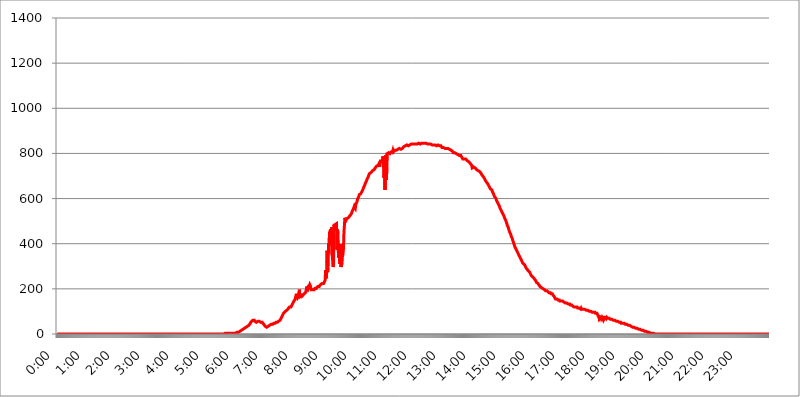
| Category | 2017.08.05. Intenzitás [W/m^2] |
|---|---|
| 0.0 | 0 |
| 0.0006944444444444445 | 0 |
| 0.001388888888888889 | 0 |
| 0.0020833333333333333 | 0 |
| 0.002777777777777778 | 0 |
| 0.003472222222222222 | 0 |
| 0.004166666666666667 | 0 |
| 0.004861111111111111 | 0 |
| 0.005555555555555556 | 0 |
| 0.0062499999999999995 | 0 |
| 0.006944444444444444 | 0 |
| 0.007638888888888889 | 0 |
| 0.008333333333333333 | 0 |
| 0.009027777777777779 | 0 |
| 0.009722222222222222 | 0 |
| 0.010416666666666666 | 0 |
| 0.011111111111111112 | 0 |
| 0.011805555555555555 | 0 |
| 0.012499999999999999 | 0 |
| 0.013194444444444444 | 0 |
| 0.013888888888888888 | 0 |
| 0.014583333333333332 | 0 |
| 0.015277777777777777 | 0 |
| 0.015972222222222224 | 0 |
| 0.016666666666666666 | 0 |
| 0.017361111111111112 | 0 |
| 0.018055555555555557 | 0 |
| 0.01875 | 0 |
| 0.019444444444444445 | 0 |
| 0.02013888888888889 | 0 |
| 0.020833333333333332 | 0 |
| 0.02152777777777778 | 0 |
| 0.022222222222222223 | 0 |
| 0.02291666666666667 | 0 |
| 0.02361111111111111 | 0 |
| 0.024305555555555556 | 0 |
| 0.024999999999999998 | 0 |
| 0.025694444444444447 | 0 |
| 0.02638888888888889 | 0 |
| 0.027083333333333334 | 0 |
| 0.027777777777777776 | 0 |
| 0.02847222222222222 | 0 |
| 0.029166666666666664 | 0 |
| 0.029861111111111113 | 0 |
| 0.030555555555555555 | 0 |
| 0.03125 | 0 |
| 0.03194444444444445 | 0 |
| 0.03263888888888889 | 0 |
| 0.03333333333333333 | 0 |
| 0.034027777777777775 | 0 |
| 0.034722222222222224 | 0 |
| 0.035416666666666666 | 0 |
| 0.036111111111111115 | 0 |
| 0.03680555555555556 | 0 |
| 0.0375 | 0 |
| 0.03819444444444444 | 0 |
| 0.03888888888888889 | 0 |
| 0.03958333333333333 | 0 |
| 0.04027777777777778 | 0 |
| 0.04097222222222222 | 0 |
| 0.041666666666666664 | 0 |
| 0.042361111111111106 | 0 |
| 0.04305555555555556 | 0 |
| 0.043750000000000004 | 0 |
| 0.044444444444444446 | 0 |
| 0.04513888888888889 | 0 |
| 0.04583333333333334 | 0 |
| 0.04652777777777778 | 0 |
| 0.04722222222222222 | 0 |
| 0.04791666666666666 | 0 |
| 0.04861111111111111 | 0 |
| 0.049305555555555554 | 0 |
| 0.049999999999999996 | 0 |
| 0.05069444444444445 | 0 |
| 0.051388888888888894 | 0 |
| 0.052083333333333336 | 0 |
| 0.05277777777777778 | 0 |
| 0.05347222222222222 | 0 |
| 0.05416666666666667 | 0 |
| 0.05486111111111111 | 0 |
| 0.05555555555555555 | 0 |
| 0.05625 | 0 |
| 0.05694444444444444 | 0 |
| 0.057638888888888885 | 0 |
| 0.05833333333333333 | 0 |
| 0.05902777777777778 | 0 |
| 0.059722222222222225 | 0 |
| 0.06041666666666667 | 0 |
| 0.061111111111111116 | 0 |
| 0.06180555555555556 | 0 |
| 0.0625 | 0 |
| 0.06319444444444444 | 0 |
| 0.06388888888888888 | 0 |
| 0.06458333333333334 | 0 |
| 0.06527777777777778 | 0 |
| 0.06597222222222222 | 0 |
| 0.06666666666666667 | 0 |
| 0.06736111111111111 | 0 |
| 0.06805555555555555 | 0 |
| 0.06874999999999999 | 0 |
| 0.06944444444444443 | 0 |
| 0.07013888888888889 | 0 |
| 0.07083333333333333 | 0 |
| 0.07152777777777779 | 0 |
| 0.07222222222222223 | 0 |
| 0.07291666666666667 | 0 |
| 0.07361111111111111 | 0 |
| 0.07430555555555556 | 0 |
| 0.075 | 0 |
| 0.07569444444444444 | 0 |
| 0.0763888888888889 | 0 |
| 0.07708333333333334 | 0 |
| 0.07777777777777778 | 0 |
| 0.07847222222222222 | 0 |
| 0.07916666666666666 | 0 |
| 0.0798611111111111 | 0 |
| 0.08055555555555556 | 0 |
| 0.08125 | 0 |
| 0.08194444444444444 | 0 |
| 0.08263888888888889 | 0 |
| 0.08333333333333333 | 0 |
| 0.08402777777777777 | 0 |
| 0.08472222222222221 | 0 |
| 0.08541666666666665 | 0 |
| 0.08611111111111112 | 0 |
| 0.08680555555555557 | 0 |
| 0.08750000000000001 | 0 |
| 0.08819444444444445 | 0 |
| 0.08888888888888889 | 0 |
| 0.08958333333333333 | 0 |
| 0.09027777777777778 | 0 |
| 0.09097222222222222 | 0 |
| 0.09166666666666667 | 0 |
| 0.09236111111111112 | 0 |
| 0.09305555555555556 | 0 |
| 0.09375 | 0 |
| 0.09444444444444444 | 0 |
| 0.09513888888888888 | 0 |
| 0.09583333333333333 | 0 |
| 0.09652777777777777 | 0 |
| 0.09722222222222222 | 0 |
| 0.09791666666666667 | 0 |
| 0.09861111111111111 | 0 |
| 0.09930555555555555 | 0 |
| 0.09999999999999999 | 0 |
| 0.10069444444444443 | 0 |
| 0.1013888888888889 | 0 |
| 0.10208333333333335 | 0 |
| 0.10277777777777779 | 0 |
| 0.10347222222222223 | 0 |
| 0.10416666666666667 | 0 |
| 0.10486111111111111 | 0 |
| 0.10555555555555556 | 0 |
| 0.10625 | 0 |
| 0.10694444444444444 | 0 |
| 0.1076388888888889 | 0 |
| 0.10833333333333334 | 0 |
| 0.10902777777777778 | 0 |
| 0.10972222222222222 | 0 |
| 0.1111111111111111 | 0 |
| 0.11180555555555556 | 0 |
| 0.11180555555555556 | 0 |
| 0.1125 | 0 |
| 0.11319444444444444 | 0 |
| 0.11388888888888889 | 0 |
| 0.11458333333333333 | 0 |
| 0.11527777777777777 | 0 |
| 0.11597222222222221 | 0 |
| 0.11666666666666665 | 0 |
| 0.1173611111111111 | 0 |
| 0.11805555555555557 | 0 |
| 0.11944444444444445 | 0 |
| 0.12013888888888889 | 0 |
| 0.12083333333333333 | 0 |
| 0.12152777777777778 | 0 |
| 0.12222222222222223 | 0 |
| 0.12291666666666667 | 0 |
| 0.12291666666666667 | 0 |
| 0.12361111111111112 | 0 |
| 0.12430555555555556 | 0 |
| 0.125 | 0 |
| 0.12569444444444444 | 0 |
| 0.12638888888888888 | 0 |
| 0.12708333333333333 | 0 |
| 0.16875 | 0 |
| 0.12847222222222224 | 0 |
| 0.12916666666666668 | 0 |
| 0.12986111111111112 | 0 |
| 0.13055555555555556 | 0 |
| 0.13125 | 0 |
| 0.13194444444444445 | 0 |
| 0.1326388888888889 | 0 |
| 0.13333333333333333 | 0 |
| 0.13402777777777777 | 0 |
| 0.13402777777777777 | 0 |
| 0.13472222222222222 | 0 |
| 0.13541666666666666 | 0 |
| 0.1361111111111111 | 0 |
| 0.13749999999999998 | 0 |
| 0.13819444444444443 | 0 |
| 0.1388888888888889 | 0 |
| 0.13958333333333334 | 0 |
| 0.14027777777777778 | 0 |
| 0.14097222222222222 | 0 |
| 0.14166666666666666 | 0 |
| 0.1423611111111111 | 0 |
| 0.14305555555555557 | 0 |
| 0.14375000000000002 | 0 |
| 0.14444444444444446 | 0 |
| 0.1451388888888889 | 0 |
| 0.1451388888888889 | 0 |
| 0.14652777777777778 | 0 |
| 0.14722222222222223 | 0 |
| 0.14791666666666667 | 0 |
| 0.1486111111111111 | 0 |
| 0.14930555555555555 | 0 |
| 0.15 | 0 |
| 0.15069444444444444 | 0 |
| 0.15138888888888888 | 0 |
| 0.15208333333333332 | 0 |
| 0.15277777777777776 | 0 |
| 0.15347222222222223 | 0 |
| 0.15416666666666667 | 0 |
| 0.15486111111111112 | 0 |
| 0.15555555555555556 | 0 |
| 0.15625 | 0 |
| 0.15694444444444444 | 0 |
| 0.15763888888888888 | 0 |
| 0.15833333333333333 | 0 |
| 0.15902777777777777 | 0 |
| 0.15972222222222224 | 0 |
| 0.16041666666666668 | 0 |
| 0.16111111111111112 | 0 |
| 0.16180555555555556 | 0 |
| 0.1625 | 0 |
| 0.16319444444444445 | 0 |
| 0.1638888888888889 | 0 |
| 0.16458333333333333 | 0 |
| 0.16527777777777777 | 0 |
| 0.16597222222222222 | 0 |
| 0.16666666666666666 | 0 |
| 0.1673611111111111 | 0 |
| 0.16805555555555554 | 0 |
| 0.16874999999999998 | 0 |
| 0.16944444444444443 | 0 |
| 0.17013888888888887 | 0 |
| 0.1708333333333333 | 0 |
| 0.17152777777777775 | 0 |
| 0.17222222222222225 | 0 |
| 0.1729166666666667 | 0 |
| 0.17361111111111113 | 0 |
| 0.17430555555555557 | 0 |
| 0.17500000000000002 | 0 |
| 0.17569444444444446 | 0 |
| 0.1763888888888889 | 0 |
| 0.17708333333333334 | 0 |
| 0.17777777777777778 | 0 |
| 0.17847222222222223 | 0 |
| 0.17916666666666667 | 0 |
| 0.1798611111111111 | 0 |
| 0.18055555555555555 | 0 |
| 0.18125 | 0 |
| 0.18194444444444444 | 0 |
| 0.1826388888888889 | 0 |
| 0.18333333333333335 | 0 |
| 0.1840277777777778 | 0 |
| 0.18472222222222223 | 0 |
| 0.18541666666666667 | 0 |
| 0.18611111111111112 | 0 |
| 0.18680555555555556 | 0 |
| 0.1875 | 0 |
| 0.18819444444444444 | 0 |
| 0.18888888888888888 | 0 |
| 0.18958333333333333 | 0 |
| 0.19027777777777777 | 0 |
| 0.1909722222222222 | 0 |
| 0.19166666666666665 | 0 |
| 0.19236111111111112 | 0 |
| 0.19305555555555554 | 0 |
| 0.19375 | 0 |
| 0.19444444444444445 | 0 |
| 0.1951388888888889 | 0 |
| 0.19583333333333333 | 0 |
| 0.19652777777777777 | 0 |
| 0.19722222222222222 | 0 |
| 0.19791666666666666 | 0 |
| 0.1986111111111111 | 0 |
| 0.19930555555555554 | 0 |
| 0.19999999999999998 | 0 |
| 0.20069444444444443 | 0 |
| 0.20138888888888887 | 0 |
| 0.2020833333333333 | 0 |
| 0.2027777777777778 | 0 |
| 0.2034722222222222 | 0 |
| 0.2041666666666667 | 0 |
| 0.20486111111111113 | 0 |
| 0.20555555555555557 | 0 |
| 0.20625000000000002 | 0 |
| 0.20694444444444446 | 0 |
| 0.2076388888888889 | 0 |
| 0.20833333333333334 | 0 |
| 0.20902777777777778 | 0 |
| 0.20972222222222223 | 0 |
| 0.21041666666666667 | 0 |
| 0.2111111111111111 | 0 |
| 0.21180555555555555 | 0 |
| 0.2125 | 0 |
| 0.21319444444444444 | 0 |
| 0.2138888888888889 | 0 |
| 0.21458333333333335 | 0 |
| 0.2152777777777778 | 0 |
| 0.21597222222222223 | 0 |
| 0.21666666666666667 | 0 |
| 0.21736111111111112 | 0 |
| 0.21805555555555556 | 0 |
| 0.21875 | 0 |
| 0.21944444444444444 | 0 |
| 0.22013888888888888 | 0 |
| 0.22083333333333333 | 0 |
| 0.22152777777777777 | 0 |
| 0.2222222222222222 | 0 |
| 0.22291666666666665 | 0 |
| 0.2236111111111111 | 0 |
| 0.22430555555555556 | 0 |
| 0.225 | 0 |
| 0.22569444444444445 | 0 |
| 0.2263888888888889 | 0 |
| 0.22708333333333333 | 0 |
| 0.22777777777777777 | 0 |
| 0.22847222222222222 | 0 |
| 0.22916666666666666 | 0 |
| 0.2298611111111111 | 0 |
| 0.23055555555555554 | 0 |
| 0.23124999999999998 | 0 |
| 0.23194444444444443 | 0 |
| 0.23263888888888887 | 0 |
| 0.2333333333333333 | 0 |
| 0.2340277777777778 | 3.525 |
| 0.2347222222222222 | 3.525 |
| 0.2354166666666667 | 3.525 |
| 0.23611111111111113 | 3.525 |
| 0.23680555555555557 | 3.525 |
| 0.23750000000000002 | 3.525 |
| 0.23819444444444446 | 3.525 |
| 0.2388888888888889 | 3.525 |
| 0.23958333333333334 | 3.525 |
| 0.24027777777777778 | 3.525 |
| 0.24097222222222223 | 3.525 |
| 0.24166666666666667 | 3.525 |
| 0.2423611111111111 | 3.525 |
| 0.24305555555555555 | 3.525 |
| 0.24375 | 3.525 |
| 0.24444444444444446 | 3.525 |
| 0.24513888888888888 | 3.525 |
| 0.24583333333333335 | 3.525 |
| 0.2465277777777778 | 3.525 |
| 0.24722222222222223 | 3.525 |
| 0.24791666666666667 | 3.525 |
| 0.24861111111111112 | 3.525 |
| 0.24930555555555556 | 3.525 |
| 0.25 | 3.525 |
| 0.25069444444444444 | 3.525 |
| 0.2513888888888889 | 3.525 |
| 0.2520833333333333 | 7.887 |
| 0.25277777777777777 | 7.887 |
| 0.2534722222222222 | 7.887 |
| 0.25416666666666665 | 7.887 |
| 0.2548611111111111 | 12.257 |
| 0.2555555555555556 | 12.257 |
| 0.25625000000000003 | 12.257 |
| 0.2569444444444445 | 12.257 |
| 0.2576388888888889 | 16.636 |
| 0.25833333333333336 | 16.636 |
| 0.2590277777777778 | 16.636 |
| 0.25972222222222224 | 21.024 |
| 0.2604166666666667 | 21.024 |
| 0.2611111111111111 | 21.024 |
| 0.26180555555555557 | 21.024 |
| 0.2625 | 25.419 |
| 0.26319444444444445 | 25.419 |
| 0.2638888888888889 | 25.419 |
| 0.26458333333333334 | 29.823 |
| 0.2652777777777778 | 29.823 |
| 0.2659722222222222 | 29.823 |
| 0.26666666666666666 | 34.234 |
| 0.2673611111111111 | 34.234 |
| 0.26805555555555555 | 38.653 |
| 0.26875 | 38.653 |
| 0.26944444444444443 | 43.079 |
| 0.2701388888888889 | 43.079 |
| 0.2708333333333333 | 47.511 |
| 0.27152777777777776 | 51.951 |
| 0.2722222222222222 | 51.951 |
| 0.27291666666666664 | 56.398 |
| 0.2736111111111111 | 56.398 |
| 0.2743055555555555 | 60.85 |
| 0.27499999999999997 | 60.85 |
| 0.27569444444444446 | 60.85 |
| 0.27638888888888885 | 60.85 |
| 0.27708333333333335 | 56.398 |
| 0.2777777777777778 | 56.398 |
| 0.27847222222222223 | 56.398 |
| 0.2791666666666667 | 51.951 |
| 0.2798611111111111 | 51.951 |
| 0.28055555555555556 | 51.951 |
| 0.28125 | 56.398 |
| 0.28194444444444444 | 56.398 |
| 0.2826388888888889 | 56.398 |
| 0.2833333333333333 | 56.398 |
| 0.28402777777777777 | 56.398 |
| 0.2847222222222222 | 56.398 |
| 0.28541666666666665 | 51.951 |
| 0.28611111111111115 | 51.951 |
| 0.28680555555555554 | 51.951 |
| 0.28750000000000003 | 51.951 |
| 0.2881944444444445 | 47.511 |
| 0.2888888888888889 | 47.511 |
| 0.28958333333333336 | 43.079 |
| 0.2902777777777778 | 38.653 |
| 0.29097222222222224 | 38.653 |
| 0.2916666666666667 | 34.234 |
| 0.2923611111111111 | 34.234 |
| 0.29305555555555557 | 29.823 |
| 0.29375 | 29.823 |
| 0.29444444444444445 | 29.823 |
| 0.2951388888888889 | 29.823 |
| 0.29583333333333334 | 34.234 |
| 0.2965277777777778 | 34.234 |
| 0.2972222222222222 | 38.653 |
| 0.29791666666666666 | 38.653 |
| 0.2986111111111111 | 38.653 |
| 0.29930555555555555 | 38.653 |
| 0.3 | 43.079 |
| 0.30069444444444443 | 43.079 |
| 0.3013888888888889 | 43.079 |
| 0.3020833333333333 | 43.079 |
| 0.30277777777777776 | 43.079 |
| 0.3034722222222222 | 47.511 |
| 0.30416666666666664 | 47.511 |
| 0.3048611111111111 | 47.511 |
| 0.3055555555555555 | 47.511 |
| 0.30624999999999997 | 47.511 |
| 0.3069444444444444 | 51.951 |
| 0.3076388888888889 | 51.951 |
| 0.30833333333333335 | 51.951 |
| 0.3090277777777778 | 51.951 |
| 0.30972222222222223 | 51.951 |
| 0.3104166666666667 | 56.398 |
| 0.3111111111111111 | 56.398 |
| 0.31180555555555556 | 56.398 |
| 0.3125 | 60.85 |
| 0.31319444444444444 | 65.31 |
| 0.3138888888888889 | 69.775 |
| 0.3145833333333333 | 74.246 |
| 0.31527777777777777 | 78.722 |
| 0.3159722222222222 | 83.205 |
| 0.31666666666666665 | 87.692 |
| 0.31736111111111115 | 92.184 |
| 0.31805555555555554 | 92.184 |
| 0.31875000000000003 | 96.682 |
| 0.3194444444444445 | 96.682 |
| 0.3201388888888889 | 101.184 |
| 0.32083333333333336 | 101.184 |
| 0.3215277777777778 | 101.184 |
| 0.32222222222222224 | 105.69 |
| 0.3229166666666667 | 105.69 |
| 0.3236111111111111 | 110.201 |
| 0.32430555555555557 | 114.716 |
| 0.325 | 114.716 |
| 0.32569444444444445 | 119.235 |
| 0.3263888888888889 | 119.235 |
| 0.32708333333333334 | 119.235 |
| 0.3277777777777778 | 119.235 |
| 0.3284722222222222 | 123.758 |
| 0.32916666666666666 | 128.284 |
| 0.3298611111111111 | 132.814 |
| 0.33055555555555555 | 137.347 |
| 0.33125 | 141.884 |
| 0.33194444444444443 | 146.423 |
| 0.3326388888888889 | 146.423 |
| 0.3333333333333333 | 150.964 |
| 0.3340277777777778 | 160.056 |
| 0.3347222222222222 | 160.056 |
| 0.3354166666666667 | 178.264 |
| 0.3361111111111111 | 164.605 |
| 0.3368055555555556 | 160.056 |
| 0.33749999999999997 | 164.605 |
| 0.33819444444444446 | 169.156 |
| 0.33888888888888885 | 182.82 |
| 0.33958333333333335 | 196.497 |
| 0.34027777777777773 | 164.605 |
| 0.34097222222222223 | 164.605 |
| 0.3416666666666666 | 164.605 |
| 0.3423611111111111 | 169.156 |
| 0.3430555555555555 | 178.264 |
| 0.34375 | 169.156 |
| 0.3444444444444445 | 169.156 |
| 0.3451388888888889 | 173.709 |
| 0.3458333333333334 | 173.709 |
| 0.34652777777777777 | 178.264 |
| 0.34722222222222227 | 178.264 |
| 0.34791666666666665 | 182.82 |
| 0.34861111111111115 | 187.378 |
| 0.34930555555555554 | 196.497 |
| 0.35000000000000003 | 210.182 |
| 0.3506944444444444 | 201.058 |
| 0.3513888888888889 | 205.62 |
| 0.3520833333333333 | 201.058 |
| 0.3527777777777778 | 201.058 |
| 0.3534722222222222 | 201.058 |
| 0.3541666666666667 | 219.309 |
| 0.3548611111111111 | 214.746 |
| 0.35555555555555557 | 205.62 |
| 0.35625 | 196.497 |
| 0.35694444444444445 | 196.497 |
| 0.3576388888888889 | 196.497 |
| 0.35833333333333334 | 196.497 |
| 0.3590277777777778 | 196.497 |
| 0.3597222222222222 | 196.497 |
| 0.36041666666666666 | 196.497 |
| 0.3611111111111111 | 201.058 |
| 0.36180555555555555 | 201.058 |
| 0.3625 | 201.058 |
| 0.36319444444444443 | 201.058 |
| 0.3638888888888889 | 205.62 |
| 0.3645833333333333 | 205.62 |
| 0.3652777777777778 | 210.182 |
| 0.3659722222222222 | 210.182 |
| 0.3666666666666667 | 210.182 |
| 0.3673611111111111 | 210.182 |
| 0.3680555555555556 | 214.746 |
| 0.36874999999999997 | 214.746 |
| 0.36944444444444446 | 219.309 |
| 0.37013888888888885 | 219.309 |
| 0.37083333333333335 | 219.309 |
| 0.37152777777777773 | 223.873 |
| 0.37222222222222223 | 223.873 |
| 0.3729166666666666 | 223.873 |
| 0.3736111111111111 | 223.873 |
| 0.3743055555555555 | 228.436 |
| 0.375 | 233 |
| 0.3756944444444445 | 237.564 |
| 0.3763888888888889 | 283.156 |
| 0.3770833333333334 | 246.689 |
| 0.37777777777777777 | 264.932 |
| 0.37847222222222227 | 369.23 |
| 0.37916666666666665 | 274.047 |
| 0.37986111111111115 | 292.259 |
| 0.38055555555555554 | 400.638 |
| 0.38125000000000003 | 391.685 |
| 0.3819444444444444 | 449.551 |
| 0.3826388888888889 | 445.129 |
| 0.3833333333333333 | 462.786 |
| 0.3840277777777778 | 396.164 |
| 0.3847222222222222 | 471.582 |
| 0.3854166666666667 | 351.198 |
| 0.3861111111111111 | 333.113 |
| 0.38680555555555557 | 296.808 |
| 0.3875 | 305.898 |
| 0.38819444444444445 | 484.735 |
| 0.3888888888888889 | 458.38 |
| 0.38958333333333334 | 484.735 |
| 0.3902777777777778 | 484.735 |
| 0.3909722222222222 | 484.735 |
| 0.39166666666666666 | 489.108 |
| 0.3923611111111111 | 373.729 |
| 0.39305555555555555 | 462.786 |
| 0.39375 | 445.129 |
| 0.39444444444444443 | 337.639 |
| 0.3951388888888889 | 346.682 |
| 0.3958333333333333 | 378.224 |
| 0.3965277777777778 | 310.44 |
| 0.3972222222222222 | 396.164 |
| 0.3979166666666667 | 296.808 |
| 0.3986111111111111 | 305.898 |
| 0.3993055555555556 | 310.44 |
| 0.39999999999999997 | 346.682 |
| 0.40069444444444446 | 351.198 |
| 0.40138888888888885 | 378.224 |
| 0.40208333333333335 | 449.551 |
| 0.40277777777777773 | 453.968 |
| 0.40347222222222223 | 515.223 |
| 0.4041666666666666 | 515.223 |
| 0.4048611111111111 | 502.192 |
| 0.4055555555555555 | 506.542 |
| 0.40625 | 510.885 |
| 0.4069444444444445 | 510.885 |
| 0.4076388888888889 | 510.885 |
| 0.4083333333333334 | 515.223 |
| 0.40902777777777777 | 515.223 |
| 0.40972222222222227 | 519.555 |
| 0.41041666666666665 | 523.88 |
| 0.41111111111111115 | 523.88 |
| 0.41180555555555554 | 528.2 |
| 0.41250000000000003 | 532.513 |
| 0.4131944444444444 | 536.82 |
| 0.4138888888888889 | 545.416 |
| 0.4145833333333333 | 549.704 |
| 0.4152777777777778 | 553.986 |
| 0.4159722222222222 | 558.261 |
| 0.4166666666666667 | 566.793 |
| 0.4173611111111111 | 566.793 |
| 0.41805555555555557 | 558.261 |
| 0.41875 | 575.299 |
| 0.41944444444444445 | 575.299 |
| 0.4201388888888889 | 583.779 |
| 0.42083333333333334 | 592.233 |
| 0.4215277777777778 | 600.661 |
| 0.4222222222222222 | 604.864 |
| 0.42291666666666666 | 609.062 |
| 0.4236111111111111 | 617.436 |
| 0.42430555555555555 | 617.436 |
| 0.425 | 617.436 |
| 0.42569444444444443 | 621.613 |
| 0.4263888888888889 | 621.613 |
| 0.4270833333333333 | 629.948 |
| 0.4277777777777778 | 634.105 |
| 0.4284722222222222 | 638.256 |
| 0.4291666666666667 | 642.4 |
| 0.4298611111111111 | 650.667 |
| 0.4305555555555556 | 654.791 |
| 0.43124999999999997 | 658.909 |
| 0.43194444444444446 | 667.123 |
| 0.43263888888888885 | 667.123 |
| 0.43333333333333335 | 675.311 |
| 0.43402777777777773 | 679.395 |
| 0.43472222222222223 | 687.544 |
| 0.4354166666666666 | 687.544 |
| 0.4361111111111111 | 695.666 |
| 0.4368055555555555 | 703.762 |
| 0.4375 | 707.8 |
| 0.4381944444444445 | 711.832 |
| 0.4388888888888889 | 715.858 |
| 0.4395833333333334 | 711.832 |
| 0.44027777777777777 | 715.858 |
| 0.44097222222222227 | 715.858 |
| 0.44166666666666665 | 715.858 |
| 0.44236111111111115 | 723.889 |
| 0.44305555555555554 | 727.896 |
| 0.44375000000000003 | 727.896 |
| 0.4444444444444444 | 727.896 |
| 0.4451388888888889 | 731.896 |
| 0.4458333333333333 | 735.89 |
| 0.4465277777777778 | 735.89 |
| 0.4472222222222222 | 739.877 |
| 0.4479166666666667 | 743.859 |
| 0.4486111111111111 | 743.859 |
| 0.44930555555555557 | 747.834 |
| 0.45 | 747.834 |
| 0.45069444444444445 | 751.803 |
| 0.4513888888888889 | 755.766 |
| 0.45208333333333334 | 739.877 |
| 0.4527777777777778 | 759.723 |
| 0.4534722222222222 | 759.723 |
| 0.45416666666666666 | 763.674 |
| 0.4548611111111111 | 767.62 |
| 0.45555555555555555 | 771.559 |
| 0.45625 | 775.492 |
| 0.45694444444444443 | 787.258 |
| 0.4576388888888889 | 747.834 |
| 0.4583333333333333 | 691.608 |
| 0.4590277777777778 | 779.42 |
| 0.4597222222222222 | 638.256 |
| 0.4604166666666667 | 791.169 |
| 0.4611111111111111 | 775.492 |
| 0.4618055555555556 | 683.473 |
| 0.46249999999999997 | 798.974 |
| 0.46319444444444446 | 798.974 |
| 0.46388888888888885 | 798.974 |
| 0.46458333333333335 | 802.868 |
| 0.46527777777777773 | 798.974 |
| 0.46597222222222223 | 798.974 |
| 0.4666666666666666 | 798.974 |
| 0.4673611111111111 | 802.868 |
| 0.4680555555555555 | 806.757 |
| 0.46875 | 806.757 |
| 0.4694444444444445 | 806.757 |
| 0.4701388888888889 | 806.757 |
| 0.4708333333333334 | 814.519 |
| 0.47152777777777777 | 806.757 |
| 0.47222222222222227 | 810.641 |
| 0.47291666666666665 | 810.641 |
| 0.47361111111111115 | 814.519 |
| 0.47430555555555554 | 814.519 |
| 0.47500000000000003 | 814.519 |
| 0.4756944444444444 | 814.519 |
| 0.4763888888888889 | 818.392 |
| 0.4770833333333333 | 818.392 |
| 0.4777777777777778 | 818.392 |
| 0.4784722222222222 | 814.519 |
| 0.4791666666666667 | 822.26 |
| 0.4798611111111111 | 822.26 |
| 0.48055555555555557 | 822.26 |
| 0.48125 | 822.26 |
| 0.48194444444444445 | 818.392 |
| 0.4826388888888889 | 818.392 |
| 0.48333333333333334 | 818.392 |
| 0.4840277777777778 | 822.26 |
| 0.4847222222222222 | 822.26 |
| 0.48541666666666666 | 826.123 |
| 0.4861111111111111 | 829.981 |
| 0.48680555555555555 | 826.123 |
| 0.4875 | 829.981 |
| 0.48819444444444443 | 833.834 |
| 0.4888888888888889 | 833.834 |
| 0.4895833333333333 | 829.981 |
| 0.4902777777777778 | 837.682 |
| 0.4909722222222222 | 833.834 |
| 0.4916666666666667 | 833.834 |
| 0.4923611111111111 | 833.834 |
| 0.4930555555555556 | 833.834 |
| 0.49374999999999997 | 837.682 |
| 0.49444444444444446 | 837.682 |
| 0.49513888888888885 | 841.526 |
| 0.49583333333333335 | 841.526 |
| 0.49652777777777773 | 841.526 |
| 0.49722222222222223 | 841.526 |
| 0.4979166666666666 | 841.526 |
| 0.4986111111111111 | 841.526 |
| 0.4993055555555555 | 841.526 |
| 0.5 | 845.365 |
| 0.5006944444444444 | 841.526 |
| 0.5013888888888889 | 841.526 |
| 0.5020833333333333 | 837.682 |
| 0.5027777777777778 | 841.526 |
| 0.5034722222222222 | 845.365 |
| 0.5041666666666667 | 845.365 |
| 0.5048611111111111 | 841.526 |
| 0.5055555555555555 | 841.526 |
| 0.50625 | 841.526 |
| 0.5069444444444444 | 845.365 |
| 0.5076388888888889 | 841.526 |
| 0.5083333333333333 | 841.526 |
| 0.5090277777777777 | 841.526 |
| 0.5097222222222222 | 845.365 |
| 0.5104166666666666 | 841.526 |
| 0.5111111111111112 | 845.365 |
| 0.5118055555555555 | 845.365 |
| 0.5125000000000001 | 845.365 |
| 0.5131944444444444 | 845.365 |
| 0.513888888888889 | 845.365 |
| 0.5145833333333333 | 845.365 |
| 0.5152777777777778 | 845.365 |
| 0.5159722222222222 | 845.365 |
| 0.5166666666666667 | 845.365 |
| 0.517361111111111 | 845.365 |
| 0.5180555555555556 | 845.365 |
| 0.5187499999999999 | 841.526 |
| 0.5194444444444445 | 841.526 |
| 0.5201388888888888 | 841.526 |
| 0.5208333333333334 | 841.526 |
| 0.5215277777777778 | 841.526 |
| 0.5222222222222223 | 841.526 |
| 0.5229166666666667 | 841.526 |
| 0.5236111111111111 | 841.526 |
| 0.5243055555555556 | 837.682 |
| 0.525 | 837.682 |
| 0.5256944444444445 | 837.682 |
| 0.5263888888888889 | 837.682 |
| 0.5270833333333333 | 837.682 |
| 0.5277777777777778 | 837.682 |
| 0.5284722222222222 | 837.682 |
| 0.5291666666666667 | 837.682 |
| 0.5298611111111111 | 837.682 |
| 0.5305555555555556 | 837.682 |
| 0.53125 | 837.682 |
| 0.5319444444444444 | 833.834 |
| 0.5326388888888889 | 833.834 |
| 0.5333333333333333 | 833.834 |
| 0.5340277777777778 | 837.682 |
| 0.5347222222222222 | 837.682 |
| 0.5354166666666667 | 837.682 |
| 0.5361111111111111 | 833.834 |
| 0.5368055555555555 | 833.834 |
| 0.5375 | 833.834 |
| 0.5381944444444444 | 833.834 |
| 0.5388888888888889 | 829.981 |
| 0.5395833333333333 | 826.123 |
| 0.5402777777777777 | 826.123 |
| 0.5409722222222222 | 826.123 |
| 0.5416666666666666 | 826.123 |
| 0.5423611111111112 | 822.26 |
| 0.5430555555555555 | 826.123 |
| 0.5437500000000001 | 822.26 |
| 0.5444444444444444 | 826.123 |
| 0.545138888888889 | 822.26 |
| 0.5458333333333333 | 822.26 |
| 0.5465277777777778 | 822.26 |
| 0.5472222222222222 | 822.26 |
| 0.5479166666666667 | 822.26 |
| 0.548611111111111 | 818.392 |
| 0.5493055555555556 | 818.392 |
| 0.5499999999999999 | 818.392 |
| 0.5506944444444445 | 818.392 |
| 0.5513888888888888 | 814.519 |
| 0.5520833333333334 | 814.519 |
| 0.5527777777777778 | 814.519 |
| 0.5534722222222223 | 814.519 |
| 0.5541666666666667 | 810.641 |
| 0.5548611111111111 | 806.757 |
| 0.5555555555555556 | 802.868 |
| 0.55625 | 802.868 |
| 0.5569444444444445 | 802.868 |
| 0.5576388888888889 | 802.868 |
| 0.5583333333333333 | 798.974 |
| 0.5590277777777778 | 802.868 |
| 0.5597222222222222 | 798.974 |
| 0.5604166666666667 | 798.974 |
| 0.5611111111111111 | 798.974 |
| 0.5618055555555556 | 795.074 |
| 0.5625 | 795.074 |
| 0.5631944444444444 | 791.169 |
| 0.5638888888888889 | 791.169 |
| 0.5645833333333333 | 795.074 |
| 0.5652777777777778 | 791.169 |
| 0.5659722222222222 | 791.169 |
| 0.5666666666666667 | 787.258 |
| 0.5673611111111111 | 783.342 |
| 0.5680555555555555 | 779.42 |
| 0.56875 | 775.492 |
| 0.5694444444444444 | 779.42 |
| 0.5701388888888889 | 775.492 |
| 0.5708333333333333 | 775.492 |
| 0.5715277777777777 | 775.492 |
| 0.5722222222222222 | 771.559 |
| 0.5729166666666666 | 775.492 |
| 0.5736111111111112 | 775.492 |
| 0.5743055555555555 | 771.559 |
| 0.5750000000000001 | 767.62 |
| 0.5756944444444444 | 767.62 |
| 0.576388888888889 | 763.674 |
| 0.5770833333333333 | 763.674 |
| 0.5777777777777778 | 759.723 |
| 0.5784722222222222 | 759.723 |
| 0.5791666666666667 | 755.766 |
| 0.579861111111111 | 751.803 |
| 0.5805555555555556 | 751.803 |
| 0.5812499999999999 | 747.834 |
| 0.5819444444444445 | 735.89 |
| 0.5826388888888888 | 739.877 |
| 0.5833333333333334 | 739.877 |
| 0.5840277777777778 | 739.877 |
| 0.5847222222222223 | 735.89 |
| 0.5854166666666667 | 735.89 |
| 0.5861111111111111 | 735.89 |
| 0.5868055555555556 | 731.896 |
| 0.5875 | 731.896 |
| 0.5881944444444445 | 727.896 |
| 0.5888888888888889 | 727.896 |
| 0.5895833333333333 | 727.896 |
| 0.5902777777777778 | 723.889 |
| 0.5909722222222222 | 723.889 |
| 0.5916666666666667 | 719.877 |
| 0.5923611111111111 | 719.877 |
| 0.5930555555555556 | 715.858 |
| 0.59375 | 715.858 |
| 0.5944444444444444 | 711.832 |
| 0.5951388888888889 | 711.832 |
| 0.5958333333333333 | 703.762 |
| 0.5965277777777778 | 703.762 |
| 0.5972222222222222 | 699.717 |
| 0.5979166666666667 | 695.666 |
| 0.5986111111111111 | 691.608 |
| 0.5993055555555555 | 687.544 |
| 0.6 | 683.473 |
| 0.6006944444444444 | 683.473 |
| 0.6013888888888889 | 675.311 |
| 0.6020833333333333 | 675.311 |
| 0.6027777777777777 | 671.22 |
| 0.6034722222222222 | 667.123 |
| 0.6041666666666666 | 663.019 |
| 0.6048611111111112 | 658.909 |
| 0.6055555555555555 | 654.791 |
| 0.6062500000000001 | 650.667 |
| 0.6069444444444444 | 650.667 |
| 0.607638888888889 | 642.4 |
| 0.6083333333333333 | 642.4 |
| 0.6090277777777778 | 642.4 |
| 0.6097222222222222 | 638.256 |
| 0.6104166666666667 | 629.948 |
| 0.611111111111111 | 625.784 |
| 0.6118055555555556 | 621.613 |
| 0.6124999999999999 | 617.436 |
| 0.6131944444444445 | 609.062 |
| 0.6138888888888888 | 609.062 |
| 0.6145833333333334 | 604.864 |
| 0.6152777777777778 | 600.661 |
| 0.6159722222222223 | 592.233 |
| 0.6166666666666667 | 588.009 |
| 0.6173611111111111 | 583.779 |
| 0.6180555555555556 | 579.542 |
| 0.61875 | 575.299 |
| 0.6194444444444445 | 571.049 |
| 0.6201388888888889 | 566.793 |
| 0.6208333333333333 | 558.261 |
| 0.6215277777777778 | 553.986 |
| 0.6222222222222222 | 549.704 |
| 0.6229166666666667 | 545.416 |
| 0.6236111111111111 | 541.121 |
| 0.6243055555555556 | 541.121 |
| 0.625 | 532.513 |
| 0.6256944444444444 | 528.2 |
| 0.6263888888888889 | 523.88 |
| 0.6270833333333333 | 519.555 |
| 0.6277777777777778 | 510.885 |
| 0.6284722222222222 | 506.542 |
| 0.6291666666666667 | 502.192 |
| 0.6298611111111111 | 497.836 |
| 0.6305555555555555 | 489.108 |
| 0.63125 | 480.356 |
| 0.6319444444444444 | 475.972 |
| 0.6326388888888889 | 471.582 |
| 0.6333333333333333 | 462.786 |
| 0.6340277777777777 | 458.38 |
| 0.6347222222222222 | 449.551 |
| 0.6354166666666666 | 445.129 |
| 0.6361111111111112 | 440.702 |
| 0.6368055555555555 | 431.833 |
| 0.6375000000000001 | 427.39 |
| 0.6381944444444444 | 422.943 |
| 0.638888888888889 | 414.035 |
| 0.6395833333333333 | 409.574 |
| 0.6402777777777778 | 400.638 |
| 0.6409722222222222 | 396.164 |
| 0.6416666666666667 | 387.202 |
| 0.642361111111111 | 382.715 |
| 0.6430555555555556 | 378.224 |
| 0.6437499999999999 | 373.729 |
| 0.6444444444444445 | 369.23 |
| 0.6451388888888888 | 364.728 |
| 0.6458333333333334 | 360.221 |
| 0.6465277777777778 | 355.712 |
| 0.6472222222222223 | 351.198 |
| 0.6479166666666667 | 346.682 |
| 0.6486111111111111 | 342.162 |
| 0.6493055555555556 | 337.639 |
| 0.65 | 333.113 |
| 0.6506944444444445 | 328.584 |
| 0.6513888888888889 | 324.052 |
| 0.6520833333333333 | 319.517 |
| 0.6527777777777778 | 314.98 |
| 0.6534722222222222 | 314.98 |
| 0.6541666666666667 | 310.44 |
| 0.6548611111111111 | 310.44 |
| 0.6555555555555556 | 305.898 |
| 0.65625 | 301.354 |
| 0.6569444444444444 | 296.808 |
| 0.6576388888888889 | 292.259 |
| 0.6583333333333333 | 292.259 |
| 0.6590277777777778 | 287.709 |
| 0.6597222222222222 | 283.156 |
| 0.6604166666666667 | 283.156 |
| 0.6611111111111111 | 278.603 |
| 0.6618055555555555 | 278.603 |
| 0.6625 | 274.047 |
| 0.6631944444444444 | 269.49 |
| 0.6638888888888889 | 264.932 |
| 0.6645833333333333 | 260.373 |
| 0.6652777777777777 | 260.373 |
| 0.6659722222222222 | 255.813 |
| 0.6666666666666666 | 255.813 |
| 0.6673611111111111 | 251.251 |
| 0.6680555555555556 | 251.251 |
| 0.6687500000000001 | 246.689 |
| 0.6694444444444444 | 242.127 |
| 0.6701388888888888 | 242.127 |
| 0.6708333333333334 | 237.564 |
| 0.6715277777777778 | 233 |
| 0.6722222222222222 | 228.436 |
| 0.6729166666666666 | 228.436 |
| 0.6736111111111112 | 228.436 |
| 0.6743055555555556 | 223.873 |
| 0.6749999999999999 | 219.309 |
| 0.6756944444444444 | 219.309 |
| 0.6763888888888889 | 214.746 |
| 0.6770833333333334 | 210.182 |
| 0.6777777777777777 | 210.182 |
| 0.6784722222222223 | 210.182 |
| 0.6791666666666667 | 205.62 |
| 0.6798611111111111 | 205.62 |
| 0.6805555555555555 | 205.62 |
| 0.68125 | 201.058 |
| 0.6819444444444445 | 201.058 |
| 0.6826388888888889 | 201.058 |
| 0.6833333333333332 | 196.497 |
| 0.6840277777777778 | 196.497 |
| 0.6847222222222222 | 191.937 |
| 0.6854166666666667 | 191.937 |
| 0.686111111111111 | 191.937 |
| 0.6868055555555556 | 191.937 |
| 0.6875 | 191.937 |
| 0.6881944444444444 | 187.378 |
| 0.688888888888889 | 187.378 |
| 0.6895833333333333 | 182.82 |
| 0.6902777777777778 | 182.82 |
| 0.6909722222222222 | 182.82 |
| 0.6916666666666668 | 182.82 |
| 0.6923611111111111 | 178.264 |
| 0.6930555555555555 | 178.264 |
| 0.69375 | 178.264 |
| 0.6944444444444445 | 178.264 |
| 0.6951388888888889 | 173.709 |
| 0.6958333333333333 | 173.709 |
| 0.6965277777777777 | 173.709 |
| 0.6972222222222223 | 164.605 |
| 0.6979166666666666 | 160.056 |
| 0.6986111111111111 | 155.509 |
| 0.6993055555555556 | 155.509 |
| 0.7000000000000001 | 155.509 |
| 0.7006944444444444 | 155.509 |
| 0.7013888888888888 | 155.509 |
| 0.7020833333333334 | 150.964 |
| 0.7027777777777778 | 150.964 |
| 0.7034722222222222 | 150.964 |
| 0.7041666666666666 | 150.964 |
| 0.7048611111111112 | 146.423 |
| 0.7055555555555556 | 146.423 |
| 0.7062499999999999 | 146.423 |
| 0.7069444444444444 | 146.423 |
| 0.7076388888888889 | 146.423 |
| 0.7083333333333334 | 146.423 |
| 0.7090277777777777 | 146.423 |
| 0.7097222222222223 | 146.423 |
| 0.7104166666666667 | 141.884 |
| 0.7111111111111111 | 141.884 |
| 0.7118055555555555 | 141.884 |
| 0.7125 | 137.347 |
| 0.7131944444444445 | 137.347 |
| 0.7138888888888889 | 137.347 |
| 0.7145833333333332 | 137.347 |
| 0.7152777777777778 | 137.347 |
| 0.7159722222222222 | 137.347 |
| 0.7166666666666667 | 132.814 |
| 0.717361111111111 | 132.814 |
| 0.7180555555555556 | 132.814 |
| 0.71875 | 132.814 |
| 0.7194444444444444 | 128.284 |
| 0.720138888888889 | 128.284 |
| 0.7208333333333333 | 128.284 |
| 0.7215277777777778 | 128.284 |
| 0.7222222222222222 | 128.284 |
| 0.7229166666666668 | 123.758 |
| 0.7236111111111111 | 123.758 |
| 0.7243055555555555 | 123.758 |
| 0.725 | 119.235 |
| 0.7256944444444445 | 119.235 |
| 0.7263888888888889 | 119.235 |
| 0.7270833333333333 | 119.235 |
| 0.7277777777777777 | 119.235 |
| 0.7284722222222223 | 119.235 |
| 0.7291666666666666 | 119.235 |
| 0.7298611111111111 | 114.716 |
| 0.7305555555555556 | 114.716 |
| 0.7312500000000001 | 114.716 |
| 0.7319444444444444 | 114.716 |
| 0.7326388888888888 | 114.716 |
| 0.7333333333333334 | 114.716 |
| 0.7340277777777778 | 110.201 |
| 0.7347222222222222 | 114.716 |
| 0.7354166666666666 | 110.201 |
| 0.7361111111111112 | 110.201 |
| 0.7368055555555556 | 110.201 |
| 0.7374999999999999 | 110.201 |
| 0.7381944444444444 | 110.201 |
| 0.7388888888888889 | 110.201 |
| 0.7395833333333334 | 110.201 |
| 0.7402777777777777 | 110.201 |
| 0.7409722222222223 | 110.201 |
| 0.7416666666666667 | 105.69 |
| 0.7423611111111111 | 105.69 |
| 0.7430555555555555 | 105.69 |
| 0.74375 | 105.69 |
| 0.7444444444444445 | 105.69 |
| 0.7451388888888889 | 105.69 |
| 0.7458333333333332 | 101.184 |
| 0.7465277777777778 | 101.184 |
| 0.7472222222222222 | 101.184 |
| 0.7479166666666667 | 101.184 |
| 0.748611111111111 | 101.184 |
| 0.7493055555555556 | 101.184 |
| 0.75 | 96.682 |
| 0.7506944444444444 | 96.682 |
| 0.751388888888889 | 96.682 |
| 0.7520833333333333 | 96.682 |
| 0.7527777777777778 | 96.682 |
| 0.7534722222222222 | 96.682 |
| 0.7541666666666668 | 96.682 |
| 0.7548611111111111 | 92.184 |
| 0.7555555555555555 | 92.184 |
| 0.75625 | 92.184 |
| 0.7569444444444445 | 92.184 |
| 0.7576388888888889 | 92.184 |
| 0.7583333333333333 | 83.205 |
| 0.7590277777777777 | 74.246 |
| 0.7597222222222223 | 83.205 |
| 0.7604166666666666 | 65.31 |
| 0.7611111111111111 | 65.31 |
| 0.7618055555555556 | 69.775 |
| 0.7625000000000001 | 78.722 |
| 0.7631944444444444 | 69.775 |
| 0.7638888888888888 | 74.246 |
| 0.7645833333333334 | 69.775 |
| 0.7652777777777778 | 65.31 |
| 0.7659722222222222 | 60.85 |
| 0.7666666666666666 | 65.31 |
| 0.7673611111111112 | 74.246 |
| 0.7680555555555556 | 74.246 |
| 0.7687499999999999 | 74.246 |
| 0.7694444444444444 | 74.246 |
| 0.7701388888888889 | 69.775 |
| 0.7708333333333334 | 74.246 |
| 0.7715277777777777 | 74.246 |
| 0.7722222222222223 | 69.775 |
| 0.7729166666666667 | 69.775 |
| 0.7736111111111111 | 69.775 |
| 0.7743055555555555 | 69.775 |
| 0.775 | 69.775 |
| 0.7756944444444445 | 65.31 |
| 0.7763888888888889 | 65.31 |
| 0.7770833333333332 | 65.31 |
| 0.7777777777777778 | 65.31 |
| 0.7784722222222222 | 65.31 |
| 0.7791666666666667 | 65.31 |
| 0.779861111111111 | 60.85 |
| 0.7805555555555556 | 60.85 |
| 0.78125 | 60.85 |
| 0.7819444444444444 | 60.85 |
| 0.782638888888889 | 60.85 |
| 0.7833333333333333 | 60.85 |
| 0.7840277777777778 | 56.398 |
| 0.7847222222222222 | 56.398 |
| 0.7854166666666668 | 56.398 |
| 0.7861111111111111 | 56.398 |
| 0.7868055555555555 | 56.398 |
| 0.7875 | 56.398 |
| 0.7881944444444445 | 51.951 |
| 0.7888888888888889 | 51.951 |
| 0.7895833333333333 | 51.951 |
| 0.7902777777777777 | 51.951 |
| 0.7909722222222223 | 47.511 |
| 0.7916666666666666 | 47.511 |
| 0.7923611111111111 | 47.511 |
| 0.7930555555555556 | 47.511 |
| 0.7937500000000001 | 47.511 |
| 0.7944444444444444 | 47.511 |
| 0.7951388888888888 | 47.511 |
| 0.7958333333333334 | 47.511 |
| 0.7965277777777778 | 43.079 |
| 0.7972222222222222 | 43.079 |
| 0.7979166666666666 | 43.079 |
| 0.7986111111111112 | 43.079 |
| 0.7993055555555556 | 38.653 |
| 0.7999999999999999 | 38.653 |
| 0.8006944444444444 | 38.653 |
| 0.8013888888888889 | 38.653 |
| 0.8020833333333334 | 38.653 |
| 0.8027777777777777 | 38.653 |
| 0.8034722222222223 | 34.234 |
| 0.8041666666666667 | 34.234 |
| 0.8048611111111111 | 34.234 |
| 0.8055555555555555 | 34.234 |
| 0.80625 | 34.234 |
| 0.8069444444444445 | 29.823 |
| 0.8076388888888889 | 29.823 |
| 0.8083333333333332 | 29.823 |
| 0.8090277777777778 | 29.823 |
| 0.8097222222222222 | 25.419 |
| 0.8104166666666667 | 25.419 |
| 0.811111111111111 | 25.419 |
| 0.8118055555555556 | 25.419 |
| 0.8125 | 25.419 |
| 0.8131944444444444 | 25.419 |
| 0.813888888888889 | 25.419 |
| 0.8145833333333333 | 21.024 |
| 0.8152777777777778 | 21.024 |
| 0.8159722222222222 | 21.024 |
| 0.8166666666666668 | 21.024 |
| 0.8173611111111111 | 21.024 |
| 0.8180555555555555 | 21.024 |
| 0.81875 | 21.024 |
| 0.8194444444444445 | 16.636 |
| 0.8201388888888889 | 16.636 |
| 0.8208333333333333 | 16.636 |
| 0.8215277777777777 | 16.636 |
| 0.8222222222222223 | 16.636 |
| 0.8229166666666666 | 12.257 |
| 0.8236111111111111 | 12.257 |
| 0.8243055555555556 | 12.257 |
| 0.8250000000000001 | 12.257 |
| 0.8256944444444444 | 12.257 |
| 0.8263888888888888 | 12.257 |
| 0.8270833333333334 | 12.257 |
| 0.8277777777777778 | 7.887 |
| 0.8284722222222222 | 7.887 |
| 0.8291666666666666 | 7.887 |
| 0.8298611111111112 | 7.887 |
| 0.8305555555555556 | 7.887 |
| 0.8312499999999999 | 7.887 |
| 0.8319444444444444 | 3.525 |
| 0.8326388888888889 | 3.525 |
| 0.8333333333333334 | 3.525 |
| 0.8340277777777777 | 3.525 |
| 0.8347222222222223 | 3.525 |
| 0.8354166666666667 | 3.525 |
| 0.8361111111111111 | 3.525 |
| 0.8368055555555555 | 0 |
| 0.8375 | 0 |
| 0.8381944444444445 | 0 |
| 0.8388888888888889 | 0 |
| 0.8395833333333332 | 0 |
| 0.8402777777777778 | 0 |
| 0.8409722222222222 | 0 |
| 0.8416666666666667 | 0 |
| 0.842361111111111 | 0 |
| 0.8430555555555556 | 0 |
| 0.84375 | 0 |
| 0.8444444444444444 | 0 |
| 0.845138888888889 | 0 |
| 0.8458333333333333 | 0 |
| 0.8465277777777778 | 0 |
| 0.8472222222222222 | 0 |
| 0.8479166666666668 | 0 |
| 0.8486111111111111 | 0 |
| 0.8493055555555555 | 0 |
| 0.85 | 0 |
| 0.8506944444444445 | 0 |
| 0.8513888888888889 | 0 |
| 0.8520833333333333 | 0 |
| 0.8527777777777777 | 0 |
| 0.8534722222222223 | 0 |
| 0.8541666666666666 | 0 |
| 0.8548611111111111 | 0 |
| 0.8555555555555556 | 0 |
| 0.8562500000000001 | 0 |
| 0.8569444444444444 | 0 |
| 0.8576388888888888 | 0 |
| 0.8583333333333334 | 0 |
| 0.8590277777777778 | 0 |
| 0.8597222222222222 | 0 |
| 0.8604166666666666 | 0 |
| 0.8611111111111112 | 0 |
| 0.8618055555555556 | 0 |
| 0.8624999999999999 | 0 |
| 0.8631944444444444 | 0 |
| 0.8638888888888889 | 0 |
| 0.8645833333333334 | 0 |
| 0.8652777777777777 | 0 |
| 0.8659722222222223 | 0 |
| 0.8666666666666667 | 0 |
| 0.8673611111111111 | 0 |
| 0.8680555555555555 | 0 |
| 0.86875 | 0 |
| 0.8694444444444445 | 0 |
| 0.8701388888888889 | 0 |
| 0.8708333333333332 | 0 |
| 0.8715277777777778 | 0 |
| 0.8722222222222222 | 0 |
| 0.8729166666666667 | 0 |
| 0.873611111111111 | 0 |
| 0.8743055555555556 | 0 |
| 0.875 | 0 |
| 0.8756944444444444 | 0 |
| 0.876388888888889 | 0 |
| 0.8770833333333333 | 0 |
| 0.8777777777777778 | 0 |
| 0.8784722222222222 | 0 |
| 0.8791666666666668 | 0 |
| 0.8798611111111111 | 0 |
| 0.8805555555555555 | 0 |
| 0.88125 | 0 |
| 0.8819444444444445 | 0 |
| 0.8826388888888889 | 0 |
| 0.8833333333333333 | 0 |
| 0.8840277777777777 | 0 |
| 0.8847222222222223 | 0 |
| 0.8854166666666666 | 0 |
| 0.8861111111111111 | 0 |
| 0.8868055555555556 | 0 |
| 0.8875000000000001 | 0 |
| 0.8881944444444444 | 0 |
| 0.8888888888888888 | 0 |
| 0.8895833333333334 | 0 |
| 0.8902777777777778 | 0 |
| 0.8909722222222222 | 0 |
| 0.8916666666666666 | 0 |
| 0.8923611111111112 | 0 |
| 0.8930555555555556 | 0 |
| 0.8937499999999999 | 0 |
| 0.8944444444444444 | 0 |
| 0.8951388888888889 | 0 |
| 0.8958333333333334 | 0 |
| 0.8965277777777777 | 0 |
| 0.8972222222222223 | 0 |
| 0.8979166666666667 | 0 |
| 0.8986111111111111 | 0 |
| 0.8993055555555555 | 0 |
| 0.9 | 0 |
| 0.9006944444444445 | 0 |
| 0.9013888888888889 | 0 |
| 0.9020833333333332 | 0 |
| 0.9027777777777778 | 0 |
| 0.9034722222222222 | 0 |
| 0.9041666666666667 | 0 |
| 0.904861111111111 | 0 |
| 0.9055555555555556 | 0 |
| 0.90625 | 0 |
| 0.9069444444444444 | 0 |
| 0.907638888888889 | 0 |
| 0.9083333333333333 | 0 |
| 0.9090277777777778 | 0 |
| 0.9097222222222222 | 0 |
| 0.9104166666666668 | 0 |
| 0.9111111111111111 | 0 |
| 0.9118055555555555 | 0 |
| 0.9125 | 0 |
| 0.9131944444444445 | 0 |
| 0.9138888888888889 | 0 |
| 0.9145833333333333 | 0 |
| 0.9152777777777777 | 0 |
| 0.9159722222222223 | 0 |
| 0.9166666666666666 | 0 |
| 0.9173611111111111 | 0 |
| 0.9180555555555556 | 0 |
| 0.9187500000000001 | 0 |
| 0.9194444444444444 | 0 |
| 0.9201388888888888 | 0 |
| 0.9208333333333334 | 0 |
| 0.9215277777777778 | 0 |
| 0.9222222222222222 | 0 |
| 0.9229166666666666 | 0 |
| 0.9236111111111112 | 0 |
| 0.9243055555555556 | 0 |
| 0.9249999999999999 | 0 |
| 0.9256944444444444 | 0 |
| 0.9263888888888889 | 0 |
| 0.9270833333333334 | 0 |
| 0.9277777777777777 | 0 |
| 0.9284722222222223 | 0 |
| 0.9291666666666667 | 0 |
| 0.9298611111111111 | 0 |
| 0.9305555555555555 | 0 |
| 0.93125 | 0 |
| 0.9319444444444445 | 0 |
| 0.9326388888888889 | 0 |
| 0.9333333333333332 | 0 |
| 0.9340277777777778 | 0 |
| 0.9347222222222222 | 0 |
| 0.9354166666666667 | 0 |
| 0.936111111111111 | 0 |
| 0.9368055555555556 | 0 |
| 0.9375 | 0 |
| 0.9381944444444444 | 0 |
| 0.938888888888889 | 0 |
| 0.9395833333333333 | 0 |
| 0.9402777777777778 | 0 |
| 0.9409722222222222 | 0 |
| 0.9416666666666668 | 0 |
| 0.9423611111111111 | 0 |
| 0.9430555555555555 | 0 |
| 0.94375 | 0 |
| 0.9444444444444445 | 0 |
| 0.9451388888888889 | 0 |
| 0.9458333333333333 | 0 |
| 0.9465277777777777 | 0 |
| 0.9472222222222223 | 0 |
| 0.9479166666666666 | 0 |
| 0.9486111111111111 | 0 |
| 0.9493055555555556 | 0 |
| 0.9500000000000001 | 0 |
| 0.9506944444444444 | 0 |
| 0.9513888888888888 | 0 |
| 0.9520833333333334 | 0 |
| 0.9527777777777778 | 0 |
| 0.9534722222222222 | 0 |
| 0.9541666666666666 | 0 |
| 0.9548611111111112 | 0 |
| 0.9555555555555556 | 0 |
| 0.9562499999999999 | 0 |
| 0.9569444444444444 | 0 |
| 0.9576388888888889 | 0 |
| 0.9583333333333334 | 0 |
| 0.9590277777777777 | 0 |
| 0.9597222222222223 | 0 |
| 0.9604166666666667 | 0 |
| 0.9611111111111111 | 0 |
| 0.9618055555555555 | 0 |
| 0.9625 | 0 |
| 0.9631944444444445 | 0 |
| 0.9638888888888889 | 0 |
| 0.9645833333333332 | 0 |
| 0.9652777777777778 | 0 |
| 0.9659722222222222 | 0 |
| 0.9666666666666667 | 0 |
| 0.967361111111111 | 0 |
| 0.9680555555555556 | 0 |
| 0.96875 | 0 |
| 0.9694444444444444 | 0 |
| 0.970138888888889 | 0 |
| 0.9708333333333333 | 0 |
| 0.9715277777777778 | 0 |
| 0.9722222222222222 | 0 |
| 0.9729166666666668 | 0 |
| 0.9736111111111111 | 0 |
| 0.9743055555555555 | 0 |
| 0.975 | 0 |
| 0.9756944444444445 | 0 |
| 0.9763888888888889 | 0 |
| 0.9770833333333333 | 0 |
| 0.9777777777777777 | 0 |
| 0.9784722222222223 | 0 |
| 0.9791666666666666 | 0 |
| 0.9798611111111111 | 0 |
| 0.9805555555555556 | 0 |
| 0.9812500000000001 | 0 |
| 0.9819444444444444 | 0 |
| 0.9826388888888888 | 0 |
| 0.9833333333333334 | 0 |
| 0.9840277777777778 | 0 |
| 0.9847222222222222 | 0 |
| 0.9854166666666666 | 0 |
| 0.9861111111111112 | 0 |
| 0.9868055555555556 | 0 |
| 0.9874999999999999 | 0 |
| 0.9881944444444444 | 0 |
| 0.9888888888888889 | 0 |
| 0.9895833333333334 | 0 |
| 0.9902777777777777 | 0 |
| 0.9909722222222223 | 0 |
| 0.9916666666666667 | 0 |
| 0.9923611111111111 | 0 |
| 0.9930555555555555 | 0 |
| 0.99375 | 0 |
| 0.9944444444444445 | 0 |
| 0.9951388888888889 | 0 |
| 0.9958333333333332 | 0 |
| 0.9965277777777778 | 0 |
| 0.9972222222222222 | 0 |
| 0.9979166666666667 | 0 |
| 0.998611111111111 | 0 |
| 0.9993055555555556 | 0 |